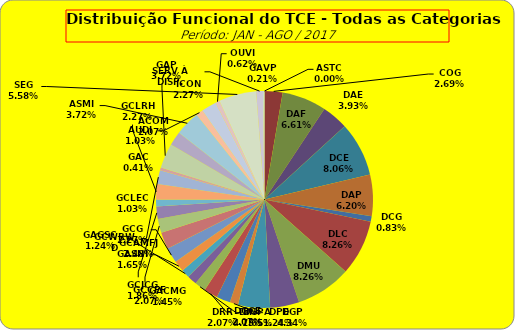
| Category | ASTC |
|---|---|
| ASTC | 0 |
| COG | 13 |
| DAF | 32 |
| DAE | 19 |
| DCE | 39 |
| DAP | 30 |
| DCG | 4 |
| DLC | 40 |
| DMU | 40 |
| DGP | 21 |
| DIN | 23 |
| DPE | 6 |
| DRR | 10 |
| DGCE | 10 |
| DGPA | 8 |
| GACMG | 7 |
| GAGSC | 6 |
| GASNI | 8 |
| GCG | 11 |
| GCAMFJ | 12 |
| GCCFF | 10 |
| GCJCG | 9 |
| GCLEC | 5 |
| GCLRH | 11 |
| GCWRWD | 10 |
| GAC | 2 |
| GAP | 18 |
| ACOM | 10 |
| ASMI | 18 |
| AUDI | 5 |
| ICON | 11 |
| OUVI | 3 |
| SEG | 27 |
| SERV À DISP. | 5 |
| GAVP | 1 |